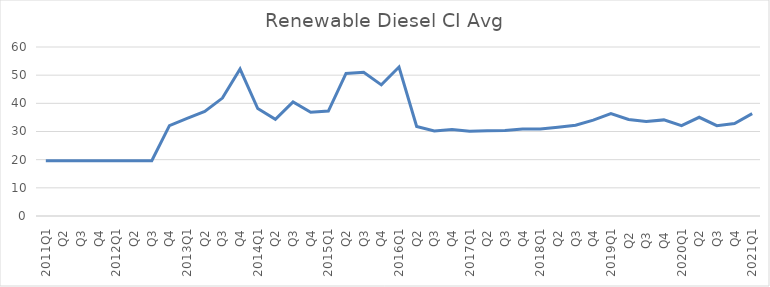
| Category | Renewable Diesel CI Avg |
|---|---|
| 2011Q1 | 19.65 |
| Q2 | 19.65 |
| Q3 | 19.65 |
| Q4 | 19.65 |
| 2012Q1 | 19.65 |
| Q2 | 19.65 |
| Q3 | 19.65 |
| Q4 | 32.11 |
| 2013Q1 | 34.65 |
| Q2 | 37.1 |
| Q3 | 41.86 |
| Q4 | 52.18 |
| 2014Q1 | 38.16 |
| Q2 | 34.32 |
| Q3 | 40.53 |
| Q4 | 36.84 |
| 2015Q1 | 37.26 |
| Q2 | 50.63 |
| Q3 | 51.06 |
| Q4 | 46.56 |
| 2016Q1 | 52.89 |
| Q2 | 31.78 |
| Q3 | 30.2 |
| Q4 | 30.71 |
| 2017Q1 | 30.11 |
| Q2 | 30.23 |
| Q3 | 30.39 |
| Q4 | 30.9 |
| 2018Q1 | 30.9 |
| Q2 | 31.53 |
| Q3 | 32.2 |
| Q4 | 34.05 |
| 2019Q1 | 36.39 |
|  Q2  | 34.25 |
|  Q3  | 33.58 |
|  Q4  | 34.12 |
| 2020Q1 | 32.1 |
| Q2 | 35.05 |
| Q3 | 32.08 |
| Q4 | 32.86 |
| 2021Q1 | 36.33 |